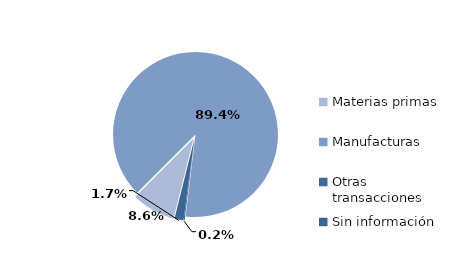
| Category | Series 0 |
|---|---|
| Materias primas | 2718.054 |
| Manufacturas | 28258.832 |
| Otras transacciones | 72.248 |
| Sin información | 552.715 |